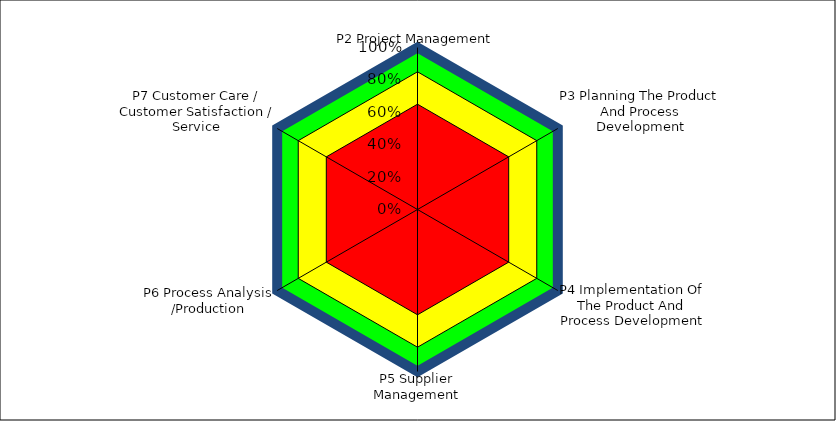
| Category | Series 0 | Series 1 | Series 2 | Series 3 |
|---|---|---|---|---|
| P2 Project Management | 1 | 0.85 | 0.65 | 1 |
| P3 Planning The Product And Process Development | 1 | 0.85 | 0.65 | 1 |
| P4 Implementation Of The Product And Process Development | 1 | 0.85 | 0.65 | 1 |
| P5 Supplier Management | 1 | 0.85 | 0.65 | 1 |
| P6 Process Analysis /Production | 1 | 0.85 | 0.65 | 1 |
| P7 Customer Care / Customer Satisfaction / Service | 1 | 0.85 | 0.65 | 1 |